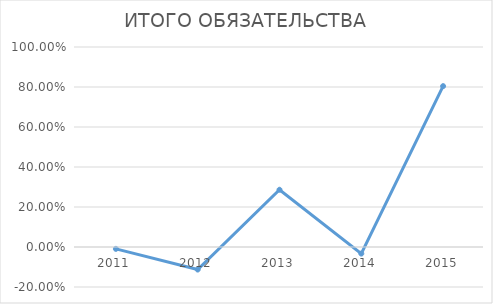
| Category | ИТОГО ОБЯЗАТЕЛЬСТВА |
|---|---|
| 2011.0 | -0.009 |
| 2012.0 | -0.113 |
| 2013.0 | 0.286 |
| 2014.0 | -0.033 |
| 2015.0 | 0.804 |